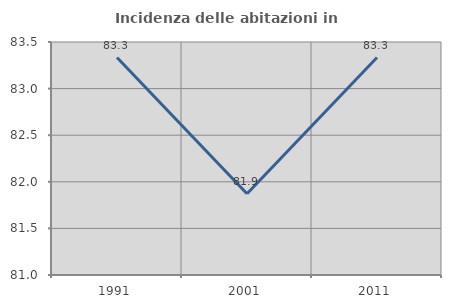
| Category | Incidenza delle abitazioni in proprietà  |
|---|---|
| 1991.0 | 83.333 |
| 2001.0 | 81.871 |
| 2011.0 | 83.333 |